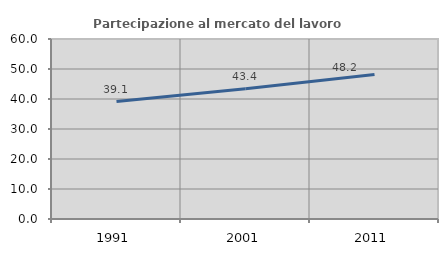
| Category | Partecipazione al mercato del lavoro  femminile |
|---|---|
| 1991.0 | 39.15 |
| 2001.0 | 43.382 |
| 2011.0 | 48.199 |